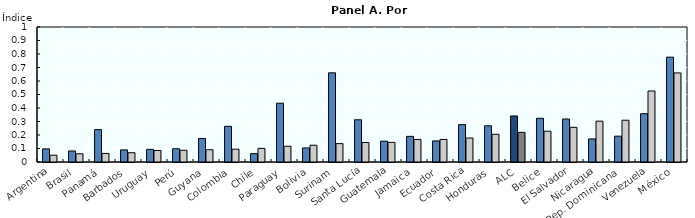
| Category | 2000 | 2015 |
|---|---|---|
| Argentina | 0.097 | 0.05 |
| Brasil | 0.082 | 0.061 |
| Panamá | 0.24 | 0.063 |
| Barbados | 0.09 | 0.069 |
| Uruguay | 0.094 | 0.085 |
| Perú | 0.098 | 0.087 |
| Guyana | 0.175 | 0.091 |
| Colombia | 0.264 | 0.095 |
| Chile | 0.062 | 0.101 |
| Paraguay | 0.436 | 0.117 |
| Bolivia | 0.104 | 0.124 |
| Surinam | 0.661 | 0.136 |
| Santa Lucía | 0.313 | 0.144 |
| Guatemala | 0.154 | 0.145 |
| Jamaica | 0.19 | 0.167 |
| Ecuador | 0.156 | 0.167 |
| Costa Rica | 0.277 | 0.178 |
| Honduras | 0.268 | 0.205 |
| ALC | 0.341 | 0.22 |
| Belice | 0.324 | 0.228 |
| El Salvador | 0.319 | 0.257 |
| Nicaragua | 0.171 | 0.303 |
| Rep. Dominicana | 0.191 | 0.31 |
| Venezuela | 0.358 | 0.526 |
| México | 0.776 | 0.66 |